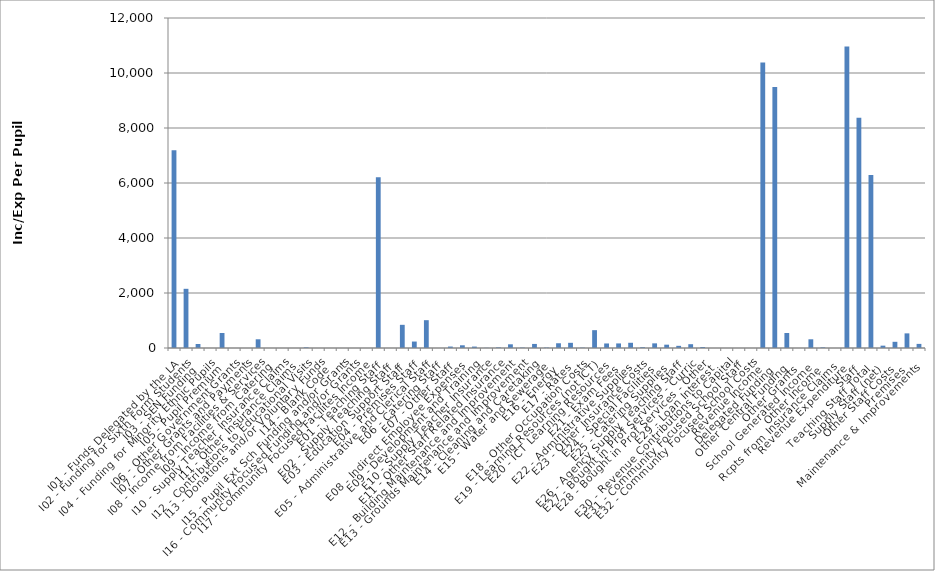
| Category | Series 0 |
|---|---|
| I01 - Funds Delegated by the LA | 7195.151 |
| I02 - Funding for Sixth Form Students | 2152.187 |
| I03 - SEN Funding | 144.989 |
| I04 - Funding for Minority Ethnic Pupils | 0 |
| I05 - Pupil Premium | 546.254 |
| I06 - Other Government Grants | 0 |
| I07 - Other Grants and Payments | 0 |
| I08 - Income from Facilities & Services | 316.943 |
| I09 - Income from Catering | 0 |
| I10 - Supply Teacher Insurance Claims | 0 |
| I11 - Other Insurance Claims | 0 |
| I12 - Contributions to Educational Visits | 22.548 |
| I13 - Donations and/or Voluntary Funds | 0 |
| I14 - Blank Code | 0 |
| I15 - Pupil Ext Sch Funding and/or Grants | 0 |
| I16 - Community Focused Funding and/or Grants | 0 |
| I17 - Community Focused Facilites Income | 0 |
| E01 - Teaching Staff | 6209.685 |
| E02 - Supply Teaching Staff | 0 |
| E03 - Education Support Staff | 842.908 |
| E04 - Premises Staff | 234.656 |
| E05 - Administrative and Clerical Staff | 1011.669 |
| E06 - Catering Staff | 0 |
| E07 - Other Staff | 52.87 |
| E08 - Indirect Employee Expenses | 98.555 |
| E09 - Development and Training | 51.86 |
| E10 - Supply Teacher Insurance | 6.16 |
| E11 - Other Staff Related Insurance | 22.027 |
| E12 - Building Maintenance and Improvement | 134.614 |
| E13 - Grounds Maintenance and Improvement | 14.783 |
| E14 - Cleaning and Caretaking | 147.826 |
| E15 - Water and Sewerage | 15.861 |
| E16 - Energy | 172.471 |
| E17 - Rates | 188.486 |
| E18 - Other Occupation Costs | 12.403 |
| E19 - Learning Resources (not ICT) | 648.574 |
| E20 - ICT Learning Resources | 164.882 |
| E21 - Exam Fees | 166.311 |
| E22 - Administrative Supplies | 189.741 |
| E23 - Other Insurance Costs | 29.341 |
| E24 - Special Facilities | 169.109 |
| E25 - Catering Supplies | 120.98 |
| E26 - Agency Supply Teaching Staff | 78.918 |
| E27 - Bought in Prof Services - Curric | 138.251 |
| E28 - Bought in Prof Services - Other | 36.749 |
| E29 - Loan Interest | 0 |
| E30 - Revenue Contributions to Capital | 0 |
| E31 - Community Focused School Staff | 0 |
| E32 - Community Focused School Costs | 0 |
| Revenue Income | 10378.071 |
| Delegated Funding | 9492.326 |
| Other Central Funding | 546.254 |
| Other Grants | 0 |
| School Generated Income | 316.943 |
| Other Income | 22.548 |
| Rcpts from Insurance Claims | 0 |
| Revenue Expenditure | 10959.692 |
| Staff | 8375.661 |
| Teaching Staff Total | 6294.763 |
| Supply Staff (net) | 85.077 |
| Other Staff Costs | 225.312 |
| Premises | 531.879 |
| Maintenance & Improvements | 149.397 |